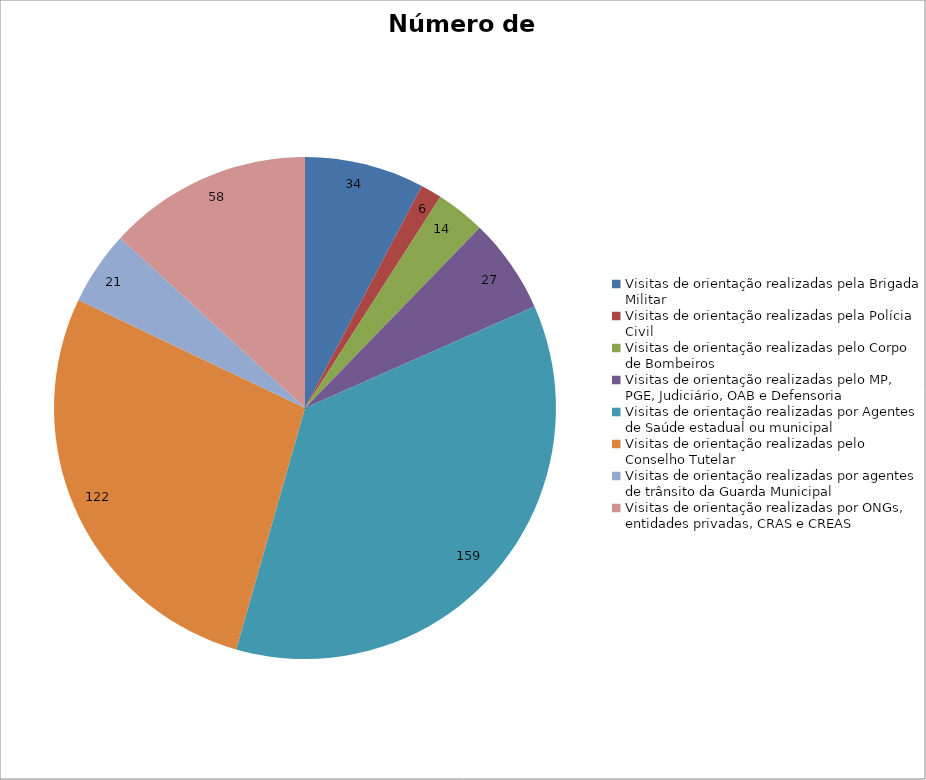
| Category | Número de Ações |
|---|---|
| Visitas de orientação realizadas pela Brigada Militar | 34 |
| Visitas de orientação realizadas pela Polícia Civil | 6 |
| Visitas de orientação realizadas pelo Corpo de Bombeiros | 14 |
| Visitas de orientação realizadas pelo MP, PGE, Judiciário, OAB e Defensoria | 27 |
| Visitas de orientação realizadas por Agentes de Saúde estadual ou municipal | 159 |
| Visitas de orientação realizadas pelo Conselho Tutelar | 122 |
| Visitas de orientação realizadas por agentes de trânsito da Guarda Municipal | 21 |
| Visitas de orientação realizadas por ONGs, entidades privadas, CRAS e CREAS | 58 |